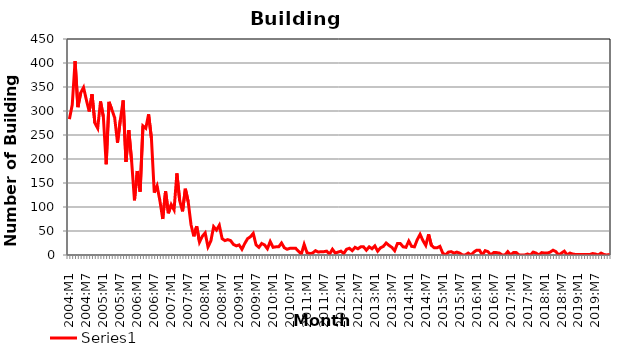
| Category | Series 0 |
|---|---|
| 2004:M1 | 283 |
| 2004:M2 | 313 |
| 2004:M3 | 404 |
| 2004:M4 | 308 |
| 2004:M5 | 338 |
| 2004:M6 | 349 |
| 2004:M7 | 323 |
| 2004:M8 | 299 |
| 2004:M9 | 335 |
| 2004:M10 | 275 |
| 2004:M11 | 264 |
| 2004:M12 | 320 |
| 2005:M1 | 288 |
| 2005:M2 | 189 |
| 2005:M3 | 319 |
| 2005:M4 | 303 |
| 2005:M5 | 286 |
| 2005:M6 | 234 |
| 2005:M7 | 281 |
| 2005:M8 | 322 |
| 2005:M9 | 194 |
| 2005:M10 | 260 |
| 2005:M11 | 195 |
| 2005:M12 | 114 |
| 2006:M1 | 175 |
| 2006:M2 | 132 |
| 2006:M3 | 269 |
| 2006:M4 | 264 |
| 2006:M5 | 293 |
| 2006:M6 | 243 |
| 2006:M7 | 130 |
| 2006:M8 | 144 |
| 2006:M9 | 113 |
| 2006:M10 | 75 |
| 2006:M11 | 133 |
| 2006:M12 | 87 |
| 2007:M1 | 105 |
| 2007:M2 | 94 |
| 2007:M3 | 170 |
| 2007:M4 | 113 |
| 2007:M5 | 91 |
| 2007:M6 | 138 |
| 2007:M7 | 111 |
| 2007:M8 | 63 |
| 2007:M9 | 39 |
| 2007:M10 | 60 |
| 2007:M11 | 27 |
| 2007:M12 | 39 |
| 2008:M1 | 46 |
| 2008:M2 | 17 |
| 2008:M3 | 29 |
| 2008:M4 | 59 |
| 2008:M5 | 52 |
| 2008:M6 | 62 |
| 2008:M7 | 34 |
| 2008:M8 | 30 |
| 2008:M9 | 32 |
| 2008:M10 | 30 |
| 2008:M11 | 22 |
| 2008:M12 | 19 |
| 2009:M1 | 21 |
| 2009:M2 | 12 |
| 2009:M3 | 24 |
| 2009:M4 | 34 |
| 2009:M5 | 38 |
| 2009:M6 | 45 |
| 2009:M7 | 21 |
| 2009:M8 | 16 |
| 2009:M9 | 24 |
| 2009:M10 | 21 |
| 2009:M11 | 13 |
| 2009:M12 | 28 |
| 2010:M1 | 16 |
| 2010:M2 | 17 |
| 2010:M3 | 17 |
| 2010:M4 | 25 |
| 2010:M5 | 15 |
| 2010:M6 | 12 |
| 2010:M7 | 14 |
| 2010:M8 | 14 |
| 2010:M9 | 14 |
| 2010:M10 | 8 |
| 2010:M11 | 2 |
| 2010:M12 | 22 |
| 2011:M1 | 5 |
| 2011:M2 | 3 |
| 2011:M3 | 4 |
| 2011:M4 | 9 |
| 2011:M5 | 6 |
| 2011:M6 | 7 |
| 2011:M7 | 7 |
| 2011:M8 | 8 |
| 2011:M9 | 2 |
| 2011:M10 | 12 |
| 2011:M11 | 4 |
| 2011:M12 | 6 |
| 2012:M1 | 8 |
| 2012:M2 | 3 |
| 2012:M3 | 12 |
| 2012:M4 | 14 |
| 2012:M5 | 9 |
| 2012:M6 | 16 |
| 2012:M7 | 13 |
| 2012:M8 | 17 |
| 2012:M9 | 17 |
| 2012:M10 | 10 |
| 2012:M11 | 17 |
| 2012:M12 | 13 |
| 2013:M1 | 19 |
| 2013:M2 | 8 |
| 2013:M3 | 15 |
| 2013:M4 | 18 |
| 2013:M5 | 25 |
| 2013:M6 | 20 |
| 2013:M7 | 16 |
| 2013:M8 | 9 |
| 2013:M9 | 24 |
| 2013:M10 | 24 |
| 2013:M11 | 17 |
| 2013:M12 | 16 |
| 2014:M1 | 29 |
| 2014:M2 | 18 |
| 2014:M3 | 17 |
| 2014:M4 | 32 |
| 2014:M5 | 43 |
| 2014:M6 | 30 |
| 2014:M7 | 20 |
| 2014:M8 | 43 |
| 2014:M9 | 20 |
| 2014:M10 | 15 |
| 2014:M11 | 15 |
| 2014:M12 | 18 |
| 2015:M1 | 4 |
| 2015:M2 | 0 |
| 2015:M3 | 6 |
| 2015:M4 | 7 |
| 2015:M5 | 4 |
| 2015:M6 | 6 |
| 2015:M7 | 4 |
| 2015:M8 | 0 |
| 2015:M9 | 0 |
| 2015:M10 | 4 |
| 2015:M11 | 0 |
| 2015:M12 | 6 |
| 2016:M1 | 10 |
| 2016:M2 | 10 |
| 2016:M3 | 0 |
| 2016:M4 | 9 |
| 2016:M5 | 7 |
| 2016:M6 | 0 |
| 2016:M7 | 5 |
| 2016:M8 | 5 |
| 2016:M9 | 4 |
| 2016:M10 | 0 |
| 2016:M11 | 0 |
| 2016:M12 | 7 |
| 2017:M1 | 0 |
| 2017:M2 | 5 |
| 2017:M3 | 5 |
| 2017:M4 | 0 |
| 2017:M5 | 0 |
| 2017:M6 | 0 |
| 2017:M7 | 2 |
| 2017:M8 | 0 |
| 2017:M9 | 6 |
| 2017:M10 | 4 |
| 2017:M11 | 0 |
| 2017:M12 | 5 |
| 2018:M1 | 4 |
| 2018:M2 | 4 |
| 2018:M3 | 6 |
| 2018:M4 | 10 |
| 2018:M5 | 7 |
| 2018:M6 | 0 |
| 2018:M7 | 4 |
| 2018:M8 | 8 |
| 2018:M9 | 0 |
| 2018:M10 | 4 |
| 2018:M11 | 2 |
| 2018:M12 | 1 |
| 2019:M1 | 1 |
| 2019:M2 | 1 |
| 2019:M3 | 1 |
| 2019:M4 | 1 |
| 2019:M5 | 1 |
| 2019:M6 | 3 |
| 2019:M7 | 2 |
| 2019:M8 | 0 |
| 2019:M9 | 4 |
| 2019:M10 | 1 |
| 2019:M11 | 0 |
| 2019:M12 | 1 |